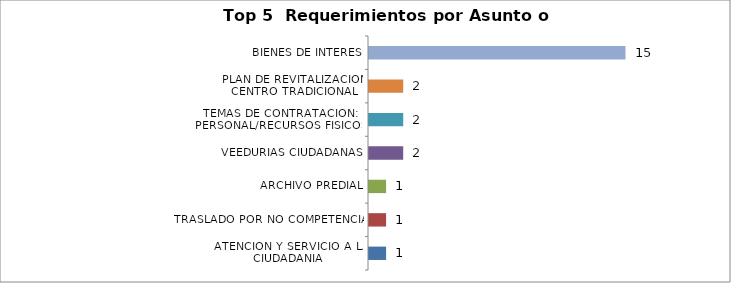
| Category | Total |
|---|---|
| ATENCION Y SERVICIO A LA CIUDADANIA | 1 |
| TRASLADO POR NO COMPETENCIA | 1 |
| ARCHIVO PREDIAL | 1 |
| VEEDURIAS CIUDADANAS | 2 |
| TEMAS DE CONTRATACION: PERSONAL/RECURSOS FISICOS | 2 |
| PLAN DE REVITALIZACION CENTRO TRADICIONAL | 2 |
| BIENES DE INTERES | 15 |